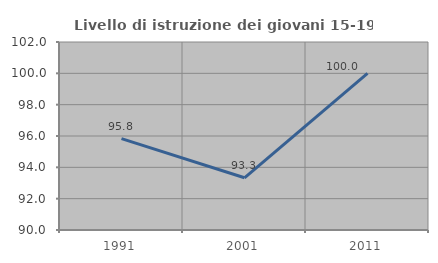
| Category | Livello di istruzione dei giovani 15-19 anni |
|---|---|
| 1991.0 | 95.833 |
| 2001.0 | 93.333 |
| 2011.0 | 100 |